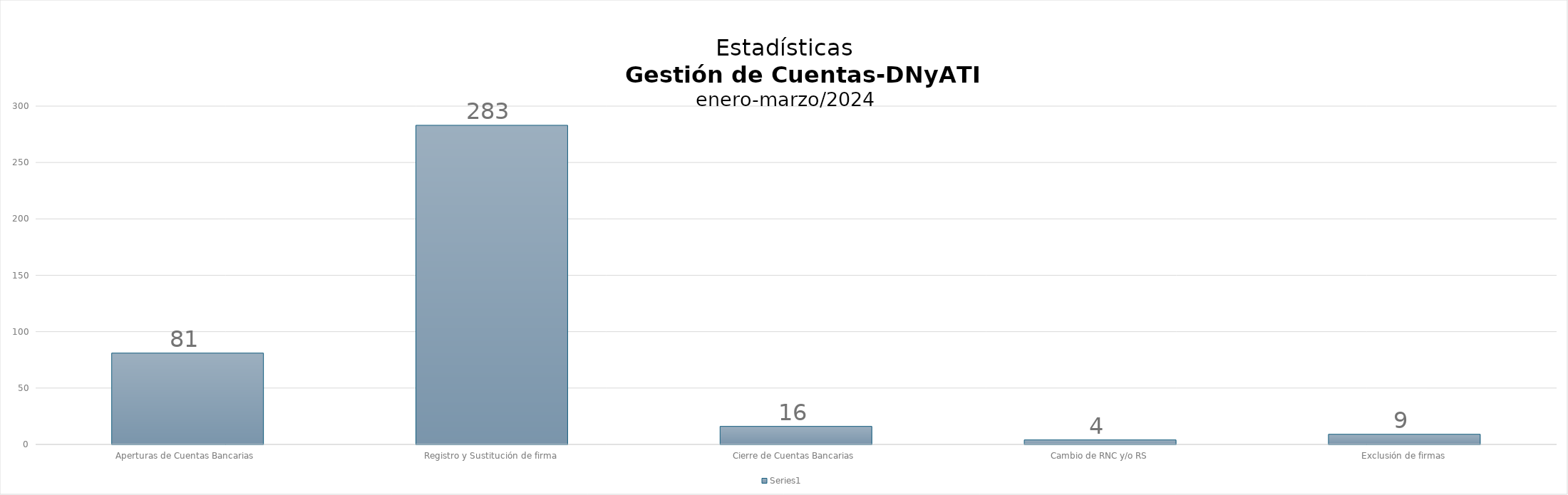
| Category | Series 0 |
|---|---|
| Aperturas de Cuentas Bancarias  | 81 |
| Registro y Sustitución de firma | 283 |
| Cierre de Cuentas Bancarias  | 16 |
| Cambio de RNC y/o RS | 4 |
| Exclusión de firmas | 9 |